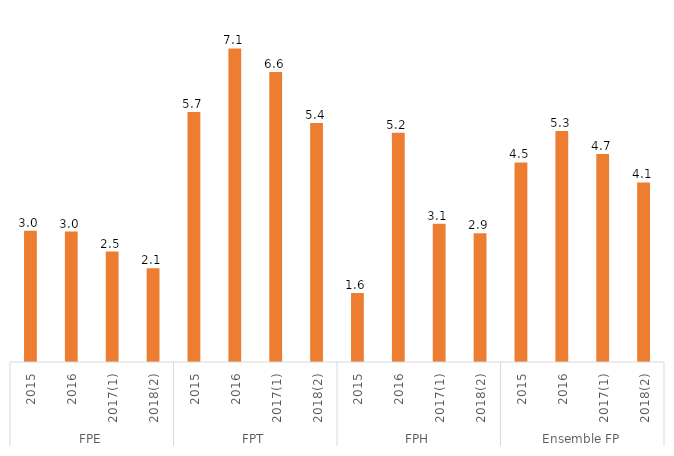
| Category | Apprentis sur travaux dangereux |
|---|---|
| 0 | 2.983 |
| 1 | 2.964 |
| 2 | 2.511 |
| 3 | 2.128 |
| 4 | 5.679 |
| 5 | 7.127 |
| 6 | 6.589 |
| 7 | 5.432 |
| 8 | 1.568 |
| 9 | 5.208 |
| 10 | 3.14 |
| 11 | 2.924 |
| 12 | 4.536 |
| 13 | 5.252 |
| 14 | 4.73 |
| 15 | 4.081 |